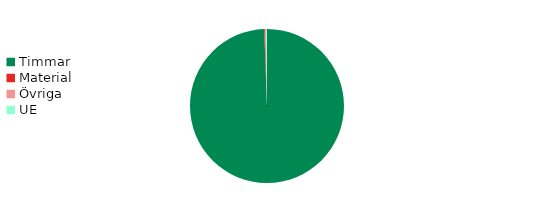
| Category | Series 0 |
|---|---|
| 0 | 0.994 |
| 1 | 0.002 |
| 2 | 0.002 |
| 3 | 0.002 |